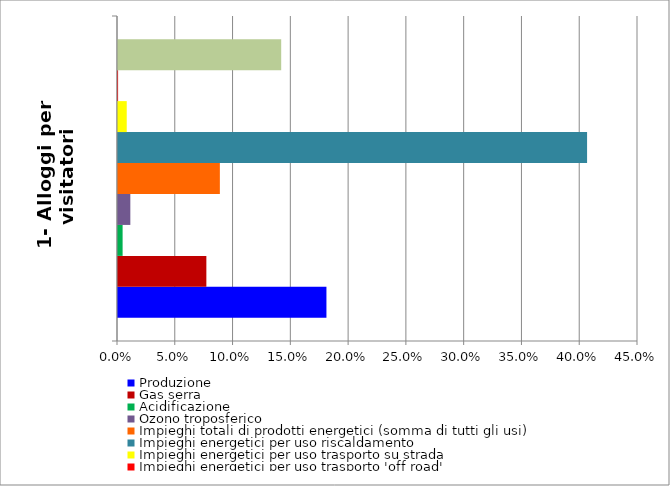
| Category | Produzione | Gas serra | Acidificazione | Ozono troposferico | Impieghi totali di prodotti energetici (somma di tutti gli usi) | Impieghi energetici per uso riscaldamento | Impieghi energetici per uso trasporto su strada | Impieghi energetici per uso trasporto 'off road' | Impieghi di elettricità |
|---|---|---|---|---|---|---|---|---|---|
| 1- Alloggi per visitatori | 0.18 | 0.076 | 0.004 | 0.011 | 0.088 | 0.406 | 0.008 | 0 | 0.141 |